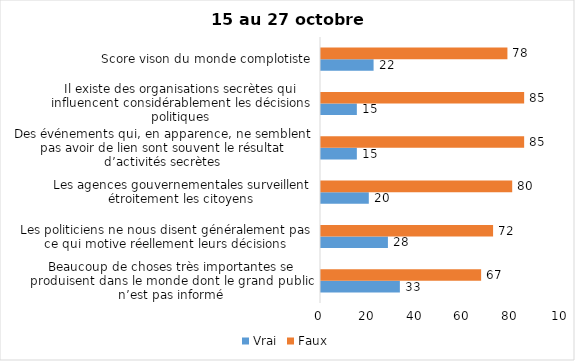
| Category | Vrai | Faux |
|---|---|---|
| Beaucoup de choses très importantes se produisent dans le monde dont le grand public n’est pas informé | 33 | 67 |
| Les politiciens ne nous disent généralement pas ce qui motive réellement leurs décisions | 28 | 72 |
| Les agences gouvernementales surveillent étroitement les citoyens | 20 | 80 |
| Des événements qui, en apparence, ne semblent pas avoir de lien sont souvent le résultat d’activités secrètes | 15 | 85 |
| Il existe des organisations secrètes qui influencent considérablement les décisions politiques | 15 | 85 |
| Score vison du monde complotiste | 22 | 78 |